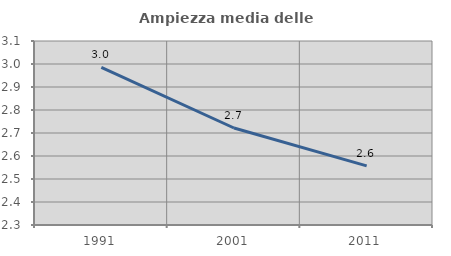
| Category | Ampiezza media delle famiglie |
|---|---|
| 1991.0 | 2.985 |
| 2001.0 | 2.722 |
| 2011.0 | 2.557 |